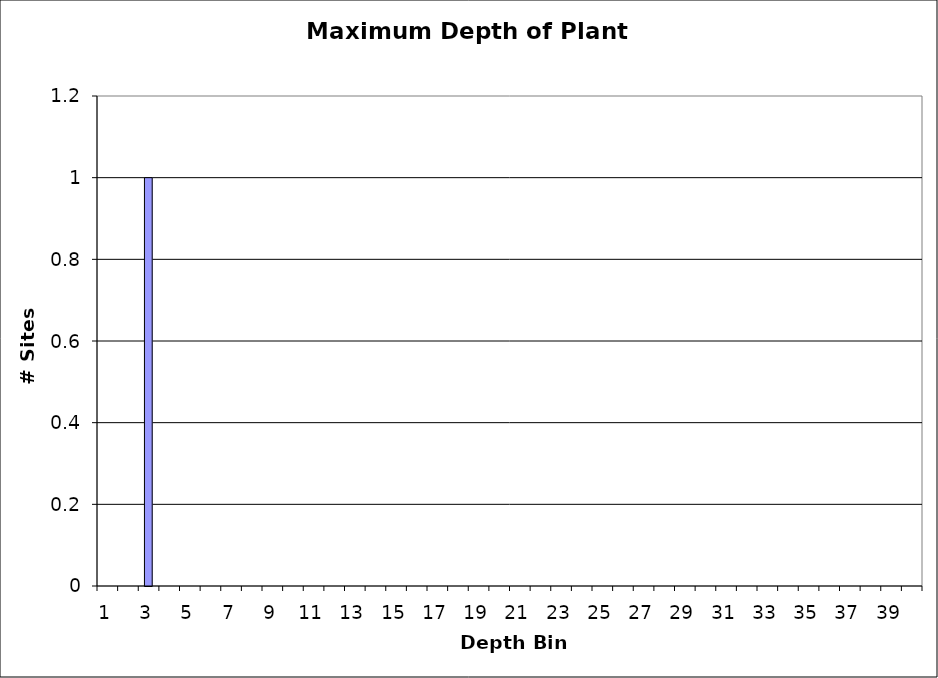
| Category | Series 0 |
|---|---|
| 1.0 | 0 |
| 2.0 | 0 |
| 3.0 | 1 |
| 4.0 | 0 |
| 5.0 | 0 |
| 6.0 | 0 |
| 7.0 | 0 |
| 8.0 | 0 |
| 9.0 | 0 |
| 10.0 | 0 |
| 11.0 | 0 |
| 12.0 | 0 |
| 13.0 | 0 |
| 14.0 | 0 |
| 15.0 | 0 |
| 16.0 | 0 |
| 17.0 | 0 |
| 18.0 | 0 |
| 19.0 | 0 |
| 20.0 | 0 |
| 21.0 | 0 |
| 22.0 | 0 |
| 23.0 | 0 |
| 24.0 | 0 |
| 25.0 | 0 |
| 26.0 | 0 |
| 27.0 | 0 |
| 28.0 | 0 |
| 29.0 | 0 |
| 30.0 | 0 |
| 31.0 | 0 |
| 32.0 | 0 |
| 33.0 | 0 |
| 34.0 | 0 |
| 35.0 | 0 |
| 36.0 | 0 |
| 37.0 | 0 |
| 38.0 | 0 |
| 39.0 | 0 |
| 40.0 | 0 |